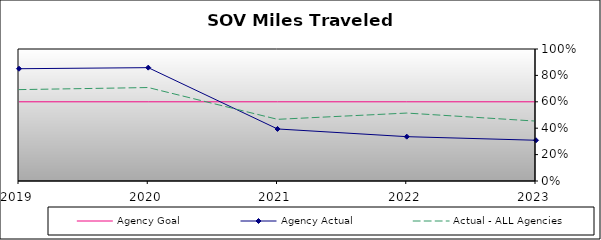
| Category | Agency Goal | Agency Actual | Actual - ALL Agencies |
|---|---|---|---|
| 2019.0 | 0.6 | 0.851 | 0.692 |
| 2020.0 | 0.6 | 0.859 | 0.708 |
| 2021.0 | 0.6 | 0.394 | 0.467 |
| 2022.0 | 0.6 | 0.336 | 0.515 |
| 2023.0 | 0.6 | 0.309 | 0.454 |